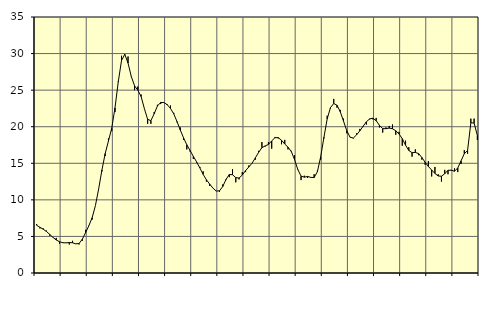
| Category | Piggar | Series 1 |
|---|---|---|
| nan | 6.7 | 6.53 |
| 87.0 | 6.1 | 6.25 |
| 87.0 | 6.1 | 5.99 |
| 87.0 | 5.8 | 5.68 |
| nan | 5.1 | 5.28 |
| 88.0 | 4.9 | 4.87 |
| 88.0 | 4.8 | 4.51 |
| 88.0 | 4 | 4.28 |
| nan | 4.2 | 4.14 |
| 89.0 | 4.1 | 4.12 |
| 89.0 | 3.9 | 4.17 |
| 89.0 | 4.4 | 4.13 |
| nan | 4 | 3.98 |
| 90.0 | 3.9 | 4.04 |
| 90.0 | 4.4 | 4.62 |
| 90.0 | 5.9 | 5.52 |
| nan | 6.5 | 6.47 |
| 91.0 | 7.3 | 7.55 |
| 91.0 | 9.2 | 9.2 |
| 91.0 | 11.5 | 11.5 |
| nan | 13.9 | 14.08 |
| 92.0 | 16 | 16.33 |
| 92.0 | 18.4 | 18.05 |
| 92.0 | 19.4 | 19.8 |
| nan | 22 | 22.57 |
| 93.0 | 26.2 | 26.13 |
| 93.0 | 29.7 | 29.04 |
| 93.0 | 29.8 | 29.9 |
| nan | 29.6 | 28.7 |
| 94.0 | 26.9 | 26.86 |
| 94.0 | 25 | 25.59 |
| 94.0 | 25.5 | 24.99 |
| nan | 24.4 | 24.13 |
| 95.0 | 22.5 | 22.48 |
| 95.0 | 20.4 | 21.01 |
| 95.0 | 20.4 | 20.83 |
| nan | 22 | 21.77 |
| 96.0 | 23 | 22.83 |
| 96.0 | 23.1 | 23.32 |
| 96.0 | 23.3 | 23.3 |
| nan | 23.1 | 23.01 |
| 97.0 | 22.9 | 22.49 |
| 97.0 | 21.9 | 21.75 |
| 97.0 | 20.6 | 20.71 |
| nan | 19.9 | 19.56 |
| 98.0 | 18.2 | 18.48 |
| 98.0 | 16.9 | 17.53 |
| 98.0 | 16.6 | 16.75 |
| nan | 15.6 | 15.95 |
| 99.0 | 15.1 | 15.19 |
| 99.0 | 14.5 | 14.36 |
| 99.0 | 13.9 | 13.49 |
| nan | 12.5 | 12.75 |
| 0.0 | 11.9 | 12.16 |
| 0.0 | 11.6 | 11.61 |
| 0.0 | 11.2 | 11.21 |
| nan | 11.1 | 11.23 |
| 1.0 | 12.1 | 11.82 |
| 1.0 | 12.7 | 12.79 |
| 1.0 | 13.1 | 13.46 |
| nan | 14.2 | 13.44 |
| 2.0 | 12.4 | 13.04 |
| 2.0 | 12.8 | 12.98 |
| 2.0 | 13.8 | 13.39 |
| nan | 13.8 | 14 |
| 3.0 | 14.7 | 14.5 |
| 3.0 | 15 | 15.02 |
| 3.0 | 15.5 | 15.74 |
| nan | 16.7 | 16.5 |
| 4.0 | 17.9 | 17.13 |
| 4.0 | 17.3 | 17.38 |
| 4.0 | 17.9 | 17.57 |
| nan | 17 | 18.06 |
| 5.0 | 18.6 | 18.5 |
| 5.0 | 18.4 | 18.51 |
| 5.0 | 17.6 | 18.15 |
| nan | 18.2 | 17.63 |
| 6.0 | 16.9 | 17.2 |
| 6.0 | 16.7 | 16.62 |
| 6.0 | 16.1 | 15.51 |
| nan | 14.2 | 14.15 |
| 7.0 | 12.7 | 13.24 |
| 7.0 | 13.3 | 13.1 |
| 7.0 | 13 | 13.2 |
| nan | 13.1 | 13.07 |
| 8.0 | 13.5 | 13.05 |
| 8.0 | 14 | 13.85 |
| 8.0 | 15.5 | 15.88 |
| nan | 18.4 | 18.55 |
| 9.0 | 21.5 | 21.07 |
| 9.0 | 22.5 | 22.61 |
| 9.0 | 23.8 | 23.17 |
| nan | 22.6 | 22.94 |
| 10.0 | 22.3 | 22.05 |
| 10.0 | 21.1 | 20.77 |
| 10.0 | 19.1 | 19.46 |
| nan | 18.6 | 18.57 |
| 11.0 | 18.4 | 18.45 |
| 11.0 | 19.1 | 18.89 |
| 11.0 | 19.7 | 19.44 |
| nan | 20 | 20.06 |
| 12.0 | 20.3 | 20.67 |
| 12.0 | 21 | 21.07 |
| 12.0 | 21 | 21.17 |
| nan | 21.2 | 20.82 |
| 13.0 | 19.9 | 20.19 |
| 13.0 | 19.2 | 19.74 |
| 13.0 | 19.9 | 19.73 |
| nan | 20.1 | 19.81 |
| 14.0 | 20.3 | 19.72 |
| 14.0 | 18.9 | 19.45 |
| 14.0 | 19.3 | 19.01 |
| nan | 17.4 | 18.37 |
| 15.0 | 18.1 | 17.48 |
| 15.0 | 17.2 | 16.75 |
| 15.0 | 15.9 | 16.45 |
| nan | 16.9 | 16.48 |
| 16.0 | 16.1 | 16.33 |
| 16.0 | 15.5 | 15.79 |
| 16.0 | 14.8 | 15.14 |
| nan | 15.3 | 14.56 |
| 17.0 | 13.2 | 14.08 |
| 17.0 | 14.5 | 13.61 |
| 17.0 | 13.5 | 13.26 |
| nan | 12.5 | 13.23 |
| 18.0 | 14.1 | 13.57 |
| 18.0 | 13.5 | 14.04 |
| 18.0 | 14 | 14.06 |
| nan | 14.3 | 13.91 |
| 19.0 | 13.8 | 14.37 |
| 19.0 | 14.9 | 15.33 |
| 19.0 | 16.8 | 16.31 |
| nan | 16.3 | 16.74 |
| 20.0 | 21.1 | 20.53 |
| 20.0 | 21.1 | 20.51 |
| 20.0 | 18.2 | 18.8 |